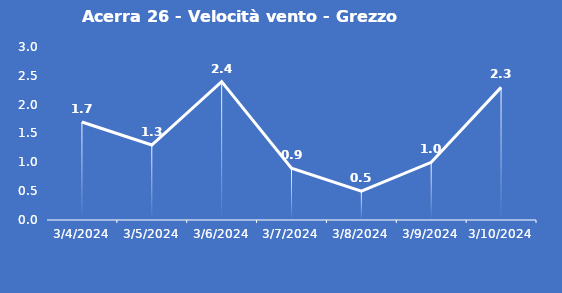
| Category | Acerra 26 - Velocità vento - Grezzo (m/s) |
|---|---|
| 3/4/24 | 1.7 |
| 3/5/24 | 1.3 |
| 3/6/24 | 2.4 |
| 3/7/24 | 0.9 |
| 3/8/24 | 0.5 |
| 3/9/24 | 1 |
| 3/10/24 | 2.3 |